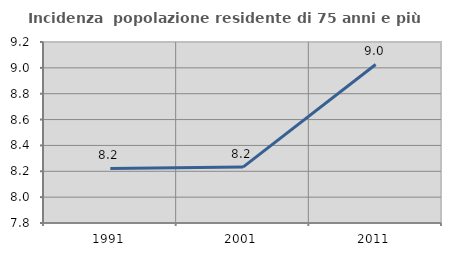
| Category | Incidenza  popolazione residente di 75 anni e più |
|---|---|
| 1991.0 | 8.222 |
| 2001.0 | 8.232 |
| 2011.0 | 9.026 |